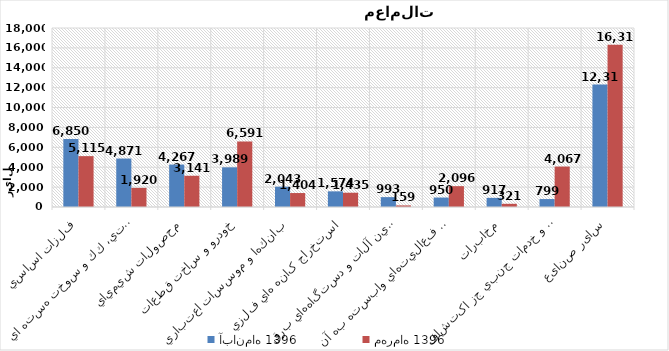
| Category | آبان‌ماه 1396 | مهرماه 1396 |
|---|---|---|
| فلزات اساسي | 6850.494 | 5114.538 |
| فراورده هاي نفتي، كك و سوخت هسته اي | 4871.484 | 1919.879 |
| محصولات شيميايي | 4266.772 | 3141.264 |
| خودرو و ساخت قطعات | 3989.436 | 6591.005 |
| بانكها و موسسات اعتباري | 2042.635 | 1403.513 |
| استخراج کانه هاي فلزي | 1573.636 | 1434.97 |
| ماشين آلات و دستگاه‌هاي برقي | 992.983 | 158.521 |
| رايانه و فعاليت‌هاي وابسته به آن | 950.488 | 2095.827 |
| مخابرات | 917.452 | 320.507 |
| استخراج نفت گاز و خدمات جنبي جز اکتشاف | 798.657 | 4067.294 |
| سایر صنایع | 12315.024 | 16314.024 |